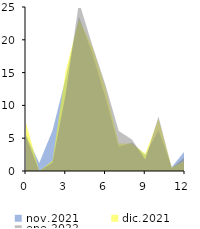
| Category | nov.2021 | dic.2021 | ene.2022 |
|---|---|---|---|
| 0.0 | 5.556 | 7.368 | 5.24 |
| 1.0 | 1.235 | 0 | 0 |
| 2.0 | 6.173 | 1.579 | 1.31 |
| 3.0 | 14.198 | 15.263 | 11.79 |
| 4.0 | 23.457 | 23.158 | 25.764 |
| 5.0 | 17.901 | 18.947 | 19.214 |
| 6.0 | 11.111 | 12.632 | 13.1 |
| 7.0 | 3.704 | 4.211 | 6.114 |
| 8.0 | 4.321 | 4.211 | 4.803 |
| 9.0 | 2.469 | 2.632 | 1.747 |
| 10.0 | 6.173 | 7.895 | 8.297 |
| 11.0 | 0.617 | 0.526 | 0.437 |
| 12.0 | 3.086 | 1.579 | 2.183 |